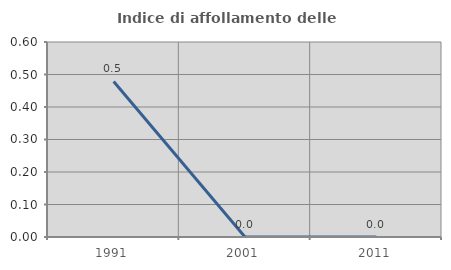
| Category | Indice di affollamento delle abitazioni  |
|---|---|
| 1991.0 | 0.478 |
| 2001.0 | 0 |
| 2011.0 | 0 |